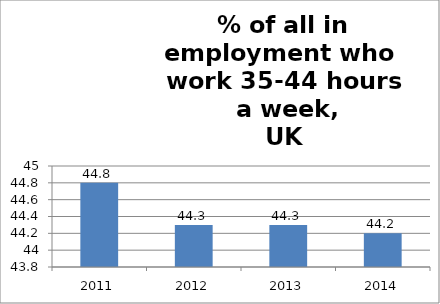
| Category | % of all in employment who work 35-44 hours |
|---|---|
| 2011.0 | 44.8 |
| 2012.0 | 44.3 |
| 2013.0 | 44.3 |
| 2014.0 | 44.2 |